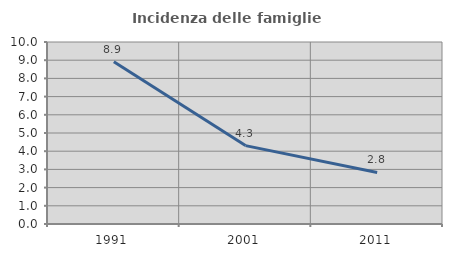
| Category | Incidenza delle famiglie numerose |
|---|---|
| 1991.0 | 8.911 |
| 2001.0 | 4.308 |
| 2011.0 | 2.833 |